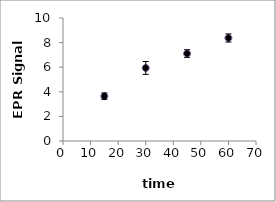
| Category | Series 3 |
|---|---|
| 15.0 | 3.643 |
| 30.0 | 5.94 |
| 45.0 | 7.11 |
| 60.0 | 8.377 |